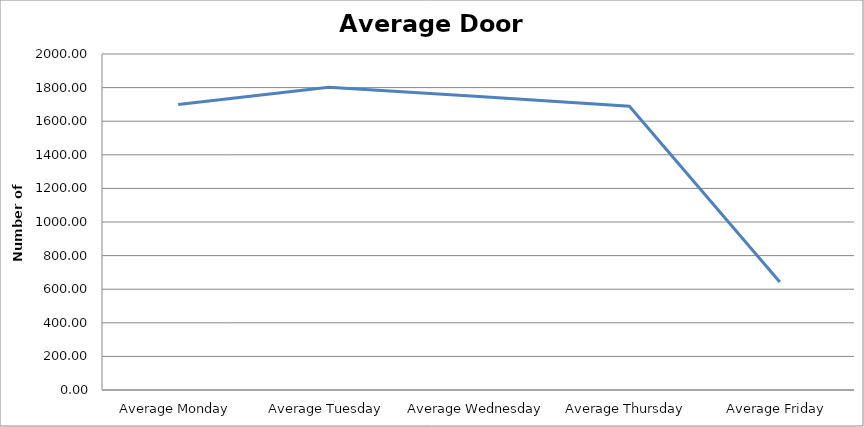
| Category | Series 0 |
|---|---|
| Average Monday | 1698.75 |
| Average Tuesday | 1802.5 |
| Average Wednesday | 1747.25 |
| Average Thursday | 1689.5 |
| Average Friday | 642.5 |